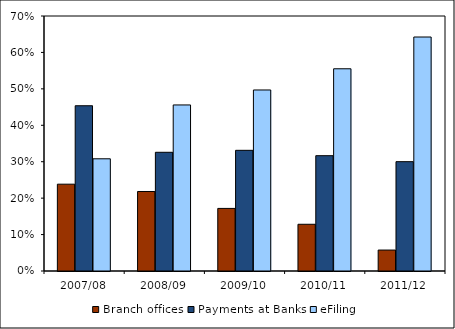
| Category | Branch offices | Payments at Banks | eFiling |
|---|---|---|---|
| 2007/08 | 0.238 | 0.454 | 0.308 |
| 2008/09 | 0.218 | 0.326 | 0.456 |
| 2009/10 | 0.172 | 0.331 | 0.497 |
| 2010/11 | 0.128 | 0.317 | 0.555 |
| 2011/12 | 0.058 | 0.3 | 0.642 |